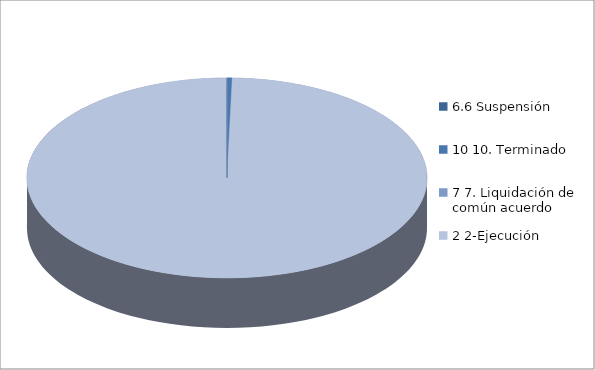
| Category | Series 0 |
|---|---|
| 6.6 Suspensión | 0 |
| 10 10. Terminado | 1 |
| 7 7. Liquidación de común acuerdo | 0 |
| 2 2-Ejecución | 237 |